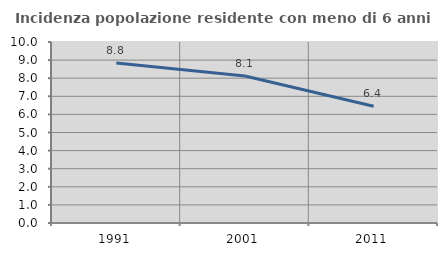
| Category | Incidenza popolazione residente con meno di 6 anni |
|---|---|
| 1991.0 | 8.834 |
| 2001.0 | 8.122 |
| 2011.0 | 6.449 |